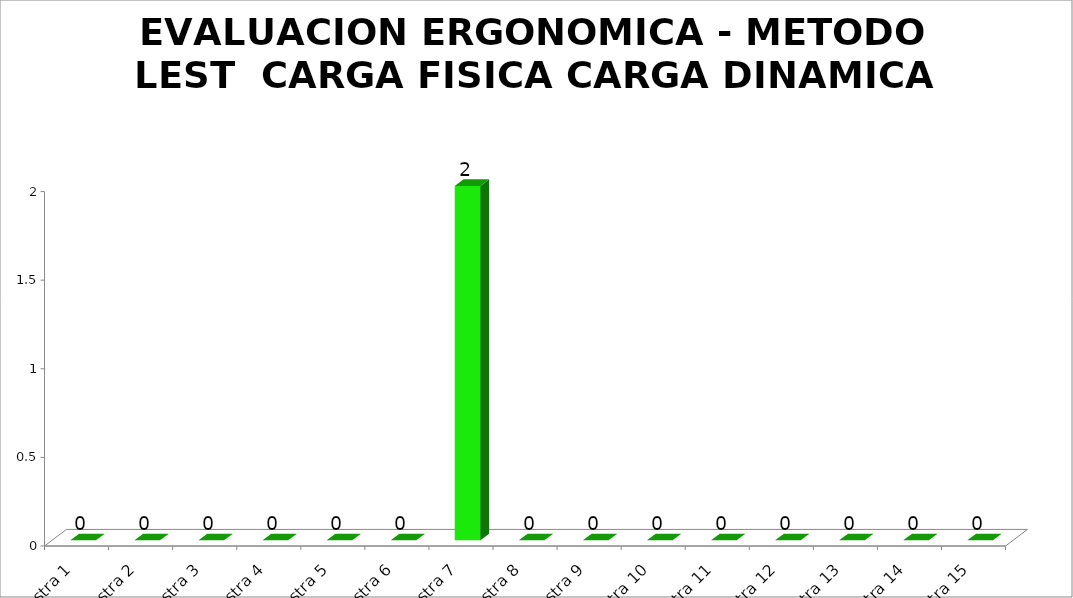
| Category | EVALUACION ERGONOMICA - METODO LEST  |
|---|---|
| muestra 1 | 0 |
| muestra 2 | 0 |
| muestra 3 | 0 |
| muestra 4 | 0 |
| muestra 5 | 0 |
| muestra 6 | 0 |
| muestra 7 | 2 |
| muestra 8 | 0 |
| muestra 9 | 0 |
| muestra 10 | 0 |
| muestra 11 | 0 |
| muestra 12 | 0 |
| muestra 13 | 0 |
| muestra 14 | 0 |
| muestra 15 | 0 |